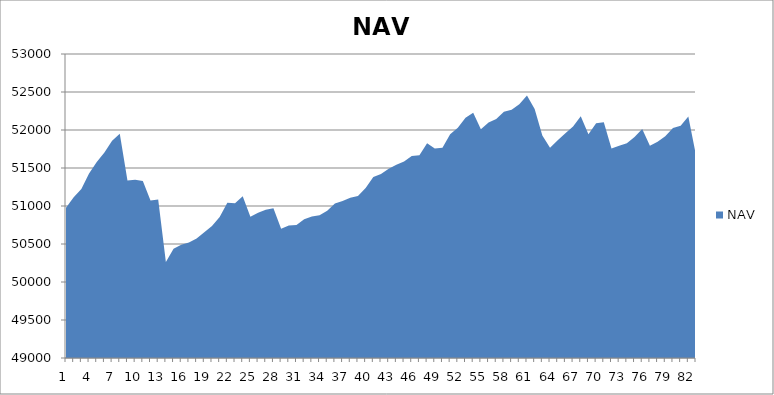
| Category | NAV |
|---|---|
| 0 | 50975.413 |
| 1 | 51115.874 |
| 2 | 51223.542 |
| 3 | 51427.364 |
| 4 | 51580.567 |
| 5 | 51704.692 |
| 6 | 51858.016 |
| 7 | 51951.766 |
| 8 | 51336.067 |
| 9 | 51345.356 |
| 10 | 51328.667 |
| 11 | 51072.985 |
| 12 | 51085.199 |
| 13 | 50261.67 |
| 14 | 50438.394 |
| 15 | 50489.896 |
| 16 | 50518.251 |
| 17 | 50572.468 |
| 18 | 50655.55 |
| 19 | 50737.787 |
| 20 | 50856.035 |
| 21 | 51041.806 |
| 22 | 51034.925 |
| 23 | 51128.589 |
| 24 | 50859.456 |
| 25 | 50911.137 |
| 26 | 50950.007 |
| 27 | 50970.175 |
| 28 | 50701.326 |
| 29 | 50743.495 |
| 30 | 50751.546 |
| 31 | 50826.725 |
| 32 | 50860.533 |
| 33 | 50879.283 |
| 34 | 50936.644 |
| 35 | 51031.381 |
| 36 | 51065.306 |
| 37 | 51109.987 |
| 38 | 51132.251 |
| 39 | 51238.242 |
| 40 | 51380.786 |
| 41 | 51420.042 |
| 42 | 51490.787 |
| 43 | 51541.14 |
| 44 | 51584.924 |
| 45 | 51657.998 |
| 46 | 51667.348 |
| 47 | 51825.763 |
| 48 | 51755.412 |
| 49 | 51767.57 |
| 50 | 51945.15 |
| 51 | 52028.391 |
| 52 | 52160.744 |
| 53 | 52227.009 |
| 54 | 52009.927 |
| 55 | 52099.094 |
| 56 | 52144.26 |
| 57 | 52240.689 |
| 58 | 52266.163 |
| 59 | 52339.405 |
| 60 | 52453.236 |
| 61 | 52275.154 |
| 62 | 51926 |
| 63 | 51766.425 |
| 64 | 51865.11 |
| 65 | 51955.727 |
| 66 | 52045.452 |
| 67 | 52179.744 |
| 68 | 51944.5 |
| 69 | 52088.896 |
| 70 | 52102.813 |
| 71 | 51756.659 |
| 72 | 51793.477 |
| 73 | 51824.02 |
| 74 | 51909.314 |
| 75 | 52012.255 |
| 76 | 51792.924 |
| 77 | 51844.353 |
| 78 | 51918.772 |
| 79 | 52026.272 |
| 80 | 52057.522 |
| 81 | 52176.272 |
| 82 | 51666.717 |